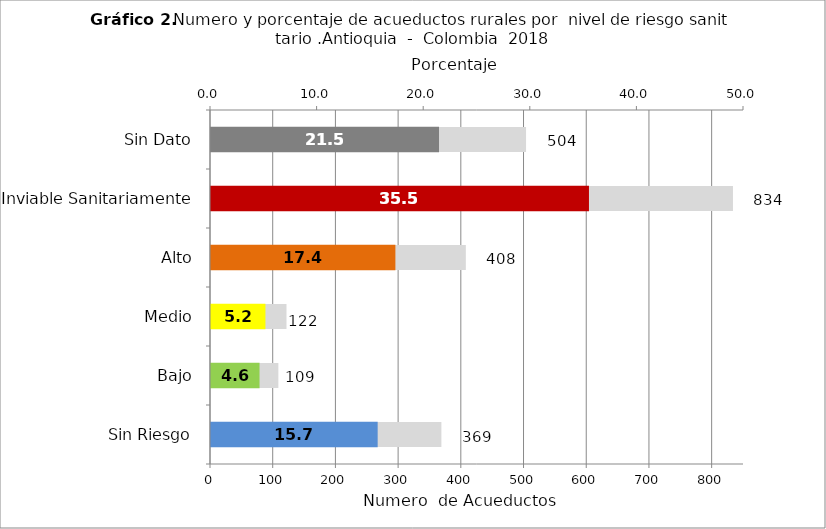
| Category | Número de Sistemas |
|---|---|
| Sin Riesgo | 369 |
| Bajo | 109 |
| Medio | 122 |
| Alto | 408 |
| Inviable Sanitariamente | 834 |
| Sin Dato | 504 |